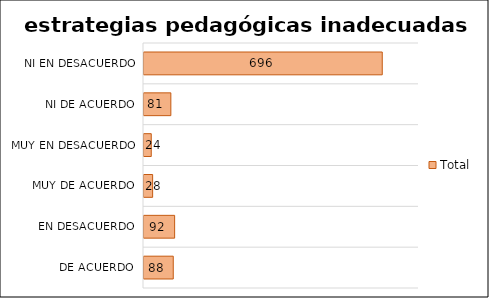
| Category | Total |
|---|---|
| De acuerdo | 88 |
| En desacuerdo | 92 |
| Muy de Acuerdo | 28 |
| Muy en desacuerdo | 24 |
| Ni de acuerdo, ni en desacuerdo | 81 |
| No responde | 696 |